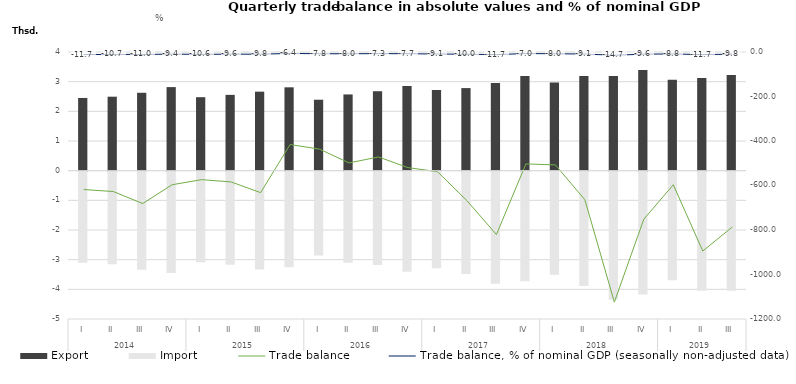
| Category | Export | Import |
|---|---|---|
| 0 | 2450.7 | -3068.8 |
| 1 | 2493.4 | -3120.5 |
| 2 | 2625.5 | -3306.5 |
| 3 | 2816.7 | -3413.2 |
| 4 | 2476.5 | -3050.1 |
| 5 | 2555.2 | -3139.2 |
| 6 | 2663.4 | -3295.5 |
| 7 | 2809.5 | -3225.4 |
| 8 | 2391.5 | -2828.1 |
| 9 | 2569.5 | -3068 |
| 10 | 2678.2 | -3149.9 |
| 11 | 2850.8 | -3370.5 |
| 12 | 2719.6 | -3257.4 |
| 13 | 2783.8 | -3452 |
| 14 | 2956.9 | -3777.4 |
| 15 | 3187 | -3690 |
| 16 | 2969.9 | -3477.4 |
| 17 | 3193.3 | -3857.4 |
| 18 | 3189.7 | -4313.9 |
| 19 | 3392.8 | -4144.2 |
| 20 | 3064.4 | -3661.1 |
| 21 | 3120.7 | -4015.1 |
| 22 | 3224.4 | -4011 |